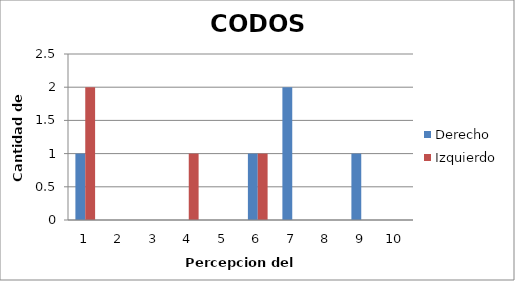
| Category | Derecho  | Izquierdo |
|---|---|---|
| 0 | 1 | 2 |
| 1 | 0 | 0 |
| 2 | 0 | 0 |
| 3 | 0 | 1 |
| 4 | 0 | 0 |
| 5 | 1 | 1 |
| 6 | 2 | 0 |
| 7 | 0 | 0 |
| 8 | 1 | 0 |
| 9 | 0 | 0 |